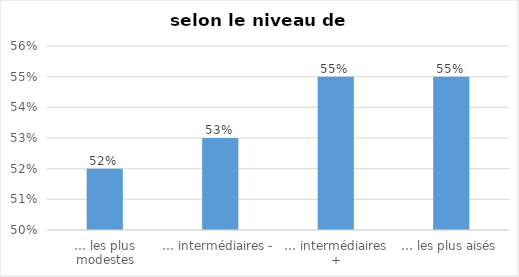
| Category | Series 0 |
|---|---|
| … les plus modestes | 0.52 |
| … intermédiaires - | 0.53 |
| … intermédiaires + | 0.55 |
| … les plus aisés | 0.55 |